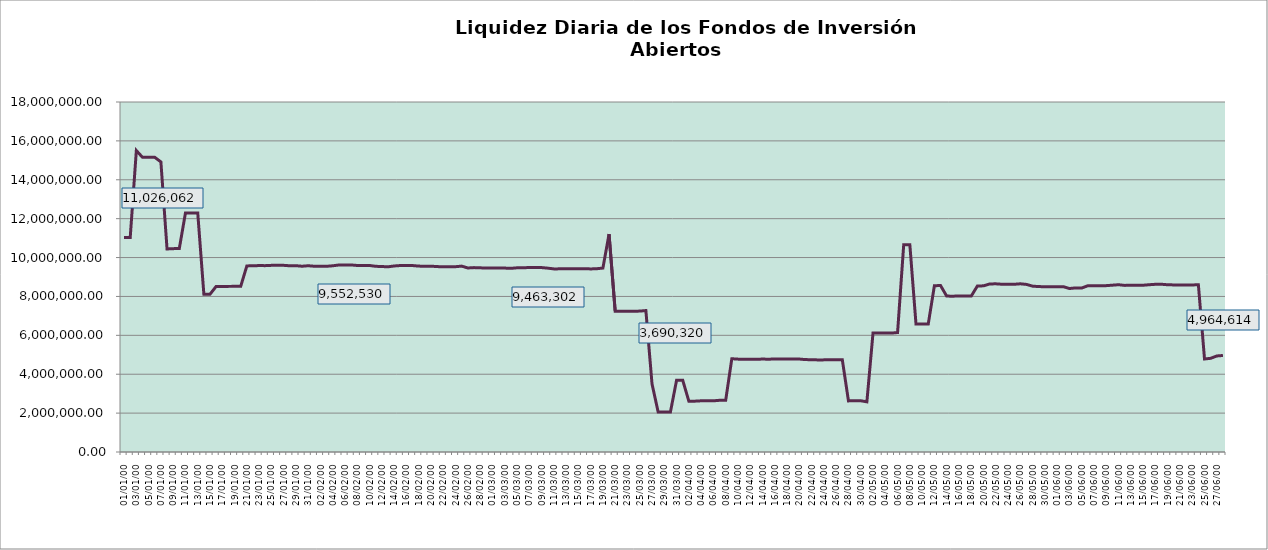
| Category | Liquidez |
|---|---|
| 0 | 11026062.18 |
| 1900-01-01 | 11027112.89 |
| 1900-01-02 | 15503700.79 |
| 1900-01-03 | 15154370.69 |
| 1900-01-04 | 15155279.65 |
| 1900-01-05 | 15156188.55 |
| 1900-01-06 | 14917065.1 |
| 1900-01-07 | 10441681.52 |
| 1900-01-08 | 10458110 |
| 1900-01-09 | 10466419.32 |
| 1900-01-10 | 12296025.64 |
| 1900-01-11 | 12296690.57 |
| 1900-01-12 | 12297355.47 |
| 1900-01-13 | 8109756.3 |
| 1900-01-14 | 8114129.99 |
| 1900-01-15 | 8516199.99 |
| 1900-01-16 | 8505135.25 |
| 1900-01-17 | 8517658.49 |
| 1900-01-18 | 8518031.77 |
| 1900-01-19 | 8518405.03 |
| 1900-01-20 | 9568927.91 |
| 1900-01-21 | 9580238.88 |
| 1900-01-22 | 9586709.52 |
| 1900-01-23 | 9584385.09 |
| 1900-01-24 | 9598846.41 |
| 1900-01-25 | 9599310.61 |
| 1900-01-26 | 9599984.17 |
| 1900-01-27 | 9576714.35 |
| 1900-01-28 | 9580921.85 |
| 1900-01-29 | 9553929.67 |
| 1900-01-30 | 9579027.48 |
| 1900-01-31 | 9552529.74 |
| 1900-02-01 | 9552089.71 |
| 1900-02-02 | 9551649.71 |
| 1900-02-03 | 9577046.62 |
| 1900-02-04 | 9617355.92 |
| 1900-02-05 | 9615200.99 |
| 1900-02-06 | 9619508.56 |
| 1900-02-07 | 9592558.08 |
| 1900-02-08 | 9592036.07 |
| 1900-02-09 | 9591514.08 |
| 1900-02-10 | 9549440.33 |
| 1900-02-11 | 9538477.94 |
| 1900-02-12 | 9523938.35 |
| 1900-02-13 | 9567368.34 |
| 1900-02-14 | 9589725.76 |
| 1900-02-15 | 9589204.07 |
| 1900-02-16 | 9588682.47 |
| 1900-02-17 | 9560016.81 |
| 1900-02-18 | 9555796.29 |
| 1900-02-19 | 9557866.94 |
| 1900-02-20 | 9534014.45 |
| 1900-02-21 | 9531022.45 |
| 1900-02-22 | 9530504.16 |
| 1900-02-23 | 9529985.93 |
| 1900-02-24 | 9559483.9 |
| 1900-02-25 | 9463735.6 |
| 1900-02-26 | 9483224.05 |
| 1900-02-27 | 9470724.56 |
| 1900-02-28 | 9464330.54 |
| 1900-02-28 | 9463816.09 |
| 1900-03-01 | 9463301.67 |
| 1900-03-02 | 9459105.56 |
| 1900-03-03 | 9445002.81 |
| 1900-03-04 | 9472345.42 |
| 1900-03-05 | 9477053.54 |
| 1900-03-06 | 9485765.92 |
| 1900-03-07 | 9485250.48 |
| 1900-03-08 | 9484854.03 |
| 1900-03-09 | 9455412.62 |
| 1900-03-10 | 9416522.77 |
| 1900-03-11 | 9418443.67 |
| 1900-03-12 | 9424016.13 |
| 1900-03-13 | 9430605.86 |
| 1900-03-14 | 9430211.78 |
| 1900-03-15 | 9429817.74 |
| 1900-03-16 | 9415213.93 |
| 1900-03-17 | 9425432.83 |
| 1900-03-18 | 9459650.65 |
| 1900-03-19 | 11206965.66 |
| 1900-03-20 | 7243250.36 |
| 1900-03-21 | 7242947.79 |
| 1900-03-22 | 7242645.22 |
| 1900-03-23 | 7241928.76 |
| 1900-03-24 | 7245717.48 |
| 1900-03-25 | 7273774.35 |
| 1900-03-26 | 3503656.98 |
| 1900-03-27 | 2057660.13 |
| 1900-03-28 | 2057574.2 |
| 1900-03-29 | 2057488.26 |
| 1900-03-30 | 3690320.33 |
| 1900-03-31 | 3693172.29 |
| 1900-04-01 | 2613630.71 |
| 1900-04-02 | 2615061.07 |
| 1900-04-03 | 2632562.54 |
| 1900-04-04 | 2632452.65 |
| 1900-04-05 | 2632342.74 |
| 1900-04-06 | 2659138.32 |
| 1900-04-07 | 2656564.21 |
| 1900-04-08 | 4796541.11 |
| 1900-04-09 | 4776220.89 |
| 1900-04-10 | 4770632.27 |
| 1900-04-11 | 4770393.35 |
| 1900-04-12 | 4770154.44 |
| 1900-04-13 | 4778762.53 |
| 1900-04-14 | 4773268.36 |
| 1900-04-15 | 4781694.35 |
| 1900-04-16 | 4784964.81 |
| 1900-04-17 | 4780723.24 |
| 1900-04-18 | 4780650.77 |
| 1900-04-19 | 4780411.43 |
| 1900-04-20 | 4750960.82 |
| 1900-04-21 | 4749848.77 |
| 1900-04-22 | 4735118.51 |
| 1900-04-23 | 4737978.53 |
| 1900-04-24 | 4739962.81 |
| 1900-04-25 | 4739725.6 |
| 1900-04-26 | 4739488.39 |
| 1900-04-27 | 2628363.67 |
| 1900-04-28 | 2635958.5 |
| 1900-04-29 | 2635826.62 |
| 1900-04-30 | 2580370.01 |
| 1900-05-01 | 6121818.81 |
| 1900-05-02 | 6121896.12 |
| 1900-05-03 | 6121589.85 |
| 1900-05-04 | 6114440.23 |
| 1900-05-05 | 6145467.3 |
| 1900-05-06 | 10657205.41 |
| 1900-05-07 | 10656030.07 |
| 1900-05-08 | 6585314.64 |
| 1900-05-09 | 6584793.2 |
| 1900-05-10 | 6584271.84 |
| 1900-05-11 | 8551926.22 |
| 1900-05-12 | 8561815.16 |
| 1900-05-13 | 8017115.28 |
| 1900-05-14 | 8015349.62 |
| 1900-05-15 | 8018909.09 |
| 1900-05-16 | 8018274.49 |
| 1900-05-17 | 8017640 |
| 1900-05-18 | 8537113.28 |
| 1900-05-19 | 8545267.72 |
| 1900-05-20 | 8641446.15 |
| 1900-05-21 | 8649152.93 |
| 1900-05-22 | 8627174.47 |
| 1900-05-23 | 8626492.08 |
| 1900-05-24 | 8625809.83 |
| 1900-05-25 | 8650252.16 |
| 1900-05-26 | 8618950.2 |
| 1900-05-27 | 8528233.13 |
| 1900-05-28 | 8507381.09 |
| 1900-05-29 | 8499990.96 |
| 1900-05-30 | 8499354.4 |
| 1900-05-31 | 8498717.92 |
| 1900-06-01 | 8502936.11 |
| 1900-06-02 | 8407091.73 |
| 1900-06-03 | 8439986.91 |
| 1900-06-04 | 8433144.76 |
| 1900-06-05 | 8551643.3 |
| 1900-06-06 | 8551003.2 |
| 1900-06-07 | 8550292.08 |
| 1900-06-08 | 8556077.9 |
| 1900-06-09 | 8579204.51 |
| 1900-06-10 | 8602940.24 |
| 1900-06-11 | 8568026.45 |
| 1900-06-12 | 8578150.93 |
| 1900-06-13 | 8577437.91 |
| 1900-06-14 | 8576725.02 |
| 1900-06-15 | 8602954.48 |
| 1900-06-16 | 8624261.61 |
| 1900-06-17 | 8626858.35 |
| 1900-06-18 | 8600597.18 |
| 1900-06-19 | 8592842.27 |
| 1900-06-20 | 8592128.45 |
| 1900-06-21 | 8591414.75 |
| 1900-06-22 | 8590701.19 |
| 1900-06-23 | 8601715.1 |
| 1900-06-24 | 4784325.77 |
| 1900-06-25 | 4817498.6 |
| 1900-06-26 | 4938835.21 |
| 1900-06-27 | 4964613.7 |